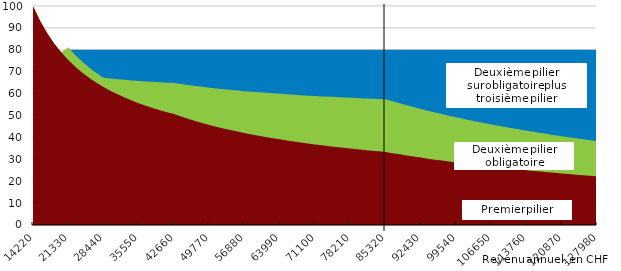
| Category | txr_toutes les rentes | txr_LPP+AVS | txr AVS |
|---|---|---|---|
| 14220.0 | 80 | 100 | 100 |
| 15642.0 | 80 | 93.287 | 93.287 |
| 17064.0 | 80 | 87.693 | 87.693 |
| 18486.0 | 80 | 82.895 | 82.895 |
| 19908.0 | 78.843 | 78.843 | 78.843 |
| 21330.0 | 80 | 80.999 | 75.331 |
| 22752.0 | 80 | 77.571 | 72.257 |
| 24174.0 | 80 | 74.547 | 69.546 |
| 25596.0 | 80 | 71.812 | 67.089 |
| 27018.0 | 80 | 69.409 | 64.934 |
| 28440.0 | 80 | 67.247 | 62.996 |
| 29862.0 | 80 | 66.908 | 61.242 |
| 31284.0 | 80 | 66.603 | 59.647 |
| 32706.0 | 80 | 66.321 | 58.191 |
| 34128.0 | 80 | 66.031 | 56.821 |
| 35550.0 | 80 | 65.795 | 55.595 |
| 36972.0 | 80 | 65.579 | 54.463 |
| 38394.0 | 80 | 65.377 | 53.415 |
| 39816.0 | 80 | 65.192 | 52.441 |
| 41238.0 | 80 | 64.989 | 51.506 |
| 42660.0 | 80 | 64.829 | 50.661 |
| 44082.0 | 80 | 64.351 | 49.544 |
| 45504.0 | 80 | 63.902 | 48.497 |
| 46926.0 | 80 | 63.483 | 47.513 |
| 48348.0 | 80 | 63.086 | 46.587 |
| 49770.0 | 80 | 62.714 | 45.714 |
| 51192.0 | 80 | 62.361 | 44.89 |
| 52614.0 | 80 | 62.029 | 44.11 |
| 54036.0 | 80 | 61.713 | 43.371 |
| 55458.0 | 80 | 61.414 | 42.67 |
| 56880.0 | 80 | 61.129 | 42.004 |
| 58302.0 | 80 | 60.859 | 41.371 |
| 59724.0 | 80 | 60.6 | 40.768 |
| 61146.0 | 80 | 60.356 | 40.192 |
| 62568.0 | 80 | 60.12 | 39.643 |
| 63990.0 | 80 | 59.897 | 39.119 |
| 65412.0 | 80 | 59.682 | 38.617 |
| 66834.0 | 80 | 59.477 | 38.136 |
| 68256.0 | 80 | 59.262 | 37.658 |
| 69678.0 | 80 | 59.075 | 37.217 |
| 71100.0 | 80 | 58.893 | 36.793 |
| 72522.0 | 80 | 58.72 | 36.386 |
| 73944.0 | 80 | 58.552 | 35.995 |
| 75366.0 | 80 | 58.392 | 35.618 |
| 76788.0 | 80 | 58.237 | 35.256 |
| 78210.0 | 80 | 58.088 | 34.906 |
| 79632.0 | 80 | 57.944 | 34.569 |
| 81054.0 | 80 | 57.805 | 34.244 |
| 82476.0 | 80 | 57.671 | 33.93 |
| 83898.0 | 80 | 57.541 | 33.627 |
| 85320.0 | 80 | 57.417 | 33.333 |
| 86742.0 | 80 | 56.476 | 32.787 |
| 88164.0 | 80 | 55.565 | 32.258 |
| 89586.0 | 80 | 54.683 | 31.746 |
| 91008.0 | 80 | 53.828 | 31.25 |
| 92430.0 | 80 | 53 | 30.769 |
| 93852.0 | 80 | 52.197 | 30.303 |
| 95274.0 | 80 | 51.418 | 29.851 |
| 96696.0 | 80 | 50.662 | 29.412 |
| 98118.0 | 80 | 49.928 | 28.986 |
| 99540.0 | 80 | 49.214 | 28.571 |
| 100962.0 | 80 | 48.521 | 28.169 |
| 102384.0 | 80 | 47.847 | 27.778 |
| 103806.0 | 80 | 47.192 | 27.397 |
| 105228.0 | 80 | 46.554 | 27.027 |
| 106650.0 | 80 | 45.933 | 26.667 |
| 108072.0 | 80 | 45.329 | 26.316 |
| 109494.0 | 80 | 44.74 | 25.974 |
| 110916.0 | 80 | 44.167 | 25.641 |
| 112338.0 | 80 | 43.608 | 25.316 |
| 113760.0 | 80 | 43.063 | 25 |
| 115182.0 | 80 | 42.531 | 24.691 |
| 116604.0 | 80 | 42.012 | 24.39 |
| 118026.0 | 80 | 41.506 | 24.096 |
| 119448.0 | 80 | 41.012 | 23.81 |
| 120870.0 | 80 | 40.529 | 23.529 |
| 122292.0 | 80 | 40.058 | 23.256 |
| 123714.0 | 80 | 39.598 | 22.989 |
| 125136.0 | 80 | 39.148 | 22.727 |
| 126558.0 | 80 | 38.708 | 22.472 |
| 127980.0 | 80 | 38.278 | 22.222 |